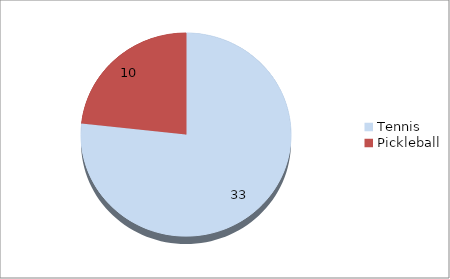
| Category | Series 0 |
|---|---|
| Tennis | 33 |
| Pickleball | 10 |